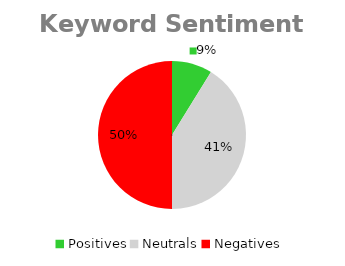
| Category | Keyword Sentiment Total |
|---|---|
| Positives | 6 |
| Neutrals | 28 |
| Negatives | 34 |